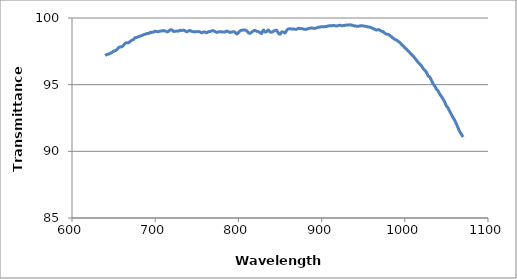
| Category | Series 0 |
|---|---|
| 640.0 | 97.18 |
| 642.0 | 97.267 |
| 644.0 | 97.294 |
| 646.0 | 97.35 |
| 648.0 | 97.417 |
| 650.0 | 97.508 |
| 652.0 | 97.548 |
| 654.0 | 97.626 |
| 656.0 | 97.777 |
| 658.0 | 97.829 |
| 660.0 | 97.851 |
| 662.0 | 97.962 |
| 664.0 | 98.097 |
| 666.0 | 98.143 |
| 668.0 | 98.143 |
| 670.0 | 98.254 |
| 672.0 | 98.333 |
| 674.0 | 98.396 |
| 676.0 | 98.529 |
| 678.0 | 98.548 |
| 680.0 | 98.592 |
| 682.0 | 98.65 |
| 684.0 | 98.682 |
| 686.0 | 98.746 |
| 688.0 | 98.785 |
| 690.0 | 98.833 |
| 692.0 | 98.835 |
| 694.0 | 98.919 |
| 696.0 | 98.922 |
| 698.0 | 98.95 |
| 700.0 | 99.012 |
| 702.0 | 98.981 |
| 704.0 | 98.979 |
| 706.0 | 99.022 |
| 708.0 | 99.031 |
| 710.0 | 99.052 |
| 712.0 | 99.031 |
| 714.0 | 98.967 |
| 716.0 | 98.996 |
| 718.0 | 99.116 |
| 720.0 | 99.101 |
| 722.0 | 98.987 |
| 724.0 | 99.009 |
| 726.0 | 99.019 |
| 728.0 | 99.016 |
| 730.0 | 99.079 |
| 732.0 | 99.059 |
| 734.0 | 99.092 |
| 736.0 | 99.035 |
| 738.0 | 98.96 |
| 740.0 | 99.029 |
| 742.0 | 99.061 |
| 744.0 | 98.989 |
| 746.0 | 98.975 |
| 748.0 | 98.969 |
| 750.0 | 98.973 |
| 752.0 | 98.988 |
| 754.0 | 98.947 |
| 756.0 | 98.892 |
| 758.0 | 98.947 |
| 760.0 | 98.951 |
| 762.0 | 98.889 |
| 764.0 | 98.976 |
| 766.0 | 98.988 |
| 768.0 | 99.035 |
| 770.0 | 99.045 |
| 772.0 | 98.977 |
| 774.0 | 98.927 |
| 776.0 | 98.953 |
| 778.0 | 98.978 |
| 780.0 | 98.951 |
| 782.0 | 98.943 |
| 784.0 | 98.951 |
| 786.0 | 99.023 |
| 788.0 | 98.966 |
| 790.0 | 98.918 |
| 792.0 | 98.949 |
| 794.0 | 98.977 |
| 796.0 | 98.93 |
| 798.0 | 98.804 |
| 800.0 | 98.897 |
| 802.0 | 99.034 |
| 804.0 | 99.078 |
| 806.0 | 99.098 |
| 808.0 | 99.096 |
| 810.0 | 99.035 |
| 812.0 | 98.895 |
| 814.0 | 98.853 |
| 816.0 | 98.942 |
| 818.0 | 99.027 |
| 820.0 | 99.066 |
| 822.0 | 99.003 |
| 824.0 | 98.985 |
| 826.0 | 98.9 |
| 828.0 | 98.849 |
| 830.0 | 99.096 |
| 832.0 | 98.959 |
| 834.0 | 98.978 |
| 836.0 | 99.1 |
| 838.0 | 98.965 |
| 840.0 | 98.935 |
| 842.0 | 99 |
| 844.0 | 99.062 |
| 846.0 | 99.078 |
| 848.0 | 98.867 |
| 850.0 | 98.786 |
| 852.0 | 98.951 |
| 854.0 | 98.936 |
| 856.0 | 98.881 |
| 858.0 | 99.069 |
| 860.0 | 99.177 |
| 862.0 | 99.194 |
| 864.0 | 99.174 |
| 866.0 | 99.17 |
| 868.0 | 99.155 |
| 870.0 | 99.156 |
| 872.0 | 99.224 |
| 874.0 | 99.205 |
| 876.0 | 99.205 |
| 878.0 | 99.173 |
| 880.0 | 99.148 |
| 882.0 | 99.157 |
| 884.0 | 99.213 |
| 886.0 | 99.235 |
| 888.0 | 99.251 |
| 890.0 | 99.232 |
| 892.0 | 99.222 |
| 894.0 | 99.261 |
| 896.0 | 99.306 |
| 898.0 | 99.317 |
| 900.0 | 99.344 |
| 902.0 | 99.341 |
| 904.0 | 99.353 |
| 906.0 | 99.368 |
| 908.0 | 99.404 |
| 910.0 | 99.422 |
| 912.0 | 99.42 |
| 914.0 | 99.441 |
| 916.0 | 99.424 |
| 918.0 | 99.396 |
| 920.0 | 99.436 |
| 922.0 | 99.461 |
| 924.0 | 99.425 |
| 926.0 | 99.428 |
| 928.0 | 99.453 |
| 930.0 | 99.472 |
| 932.0 | 99.466 |
| 934.0 | 99.489 |
| 936.0 | 99.47 |
| 938.0 | 99.434 |
| 940.0 | 99.396 |
| 942.0 | 99.389 |
| 944.0 | 99.381 |
| 946.0 | 99.399 |
| 948.0 | 99.423 |
| 950.0 | 99.402 |
| 952.0 | 99.379 |
| 954.0 | 99.36 |
| 956.0 | 99.325 |
| 958.0 | 99.312 |
| 960.0 | 99.261 |
| 962.0 | 99.213 |
| 964.0 | 99.15 |
| 966.0 | 99.095 |
| 968.0 | 99.132 |
| 970.0 | 99.082 |
| 972.0 | 99.005 |
| 974.0 | 98.976 |
| 976.0 | 98.859 |
| 978.0 | 98.791 |
| 980.0 | 98.777 |
| 982.0 | 98.688 |
| 984.0 | 98.595 |
| 986.0 | 98.489 |
| 988.0 | 98.404 |
| 990.0 | 98.339 |
| 992.0 | 98.255 |
| 994.0 | 98.16 |
| 996.0 | 98.021 |
| 998.0 | 97.913 |
| 1000.0 | 97.768 |
| 1002.0 | 97.666 |
| 1004.0 | 97.532 |
| 1006.0 | 97.408 |
| 1008.0 | 97.261 |
| 1010.0 | 97.147 |
| 1012.0 | 96.996 |
| 1014.0 | 96.84 |
| 1016.0 | 96.684 |
| 1018.0 | 96.553 |
| 1020.0 | 96.409 |
| 1022.0 | 96.215 |
| 1024.0 | 96.081 |
| 1026.0 | 95.925 |
| 1028.0 | 95.668 |
| 1030.0 | 95.567 |
| 1032.0 | 95.328 |
| 1034.0 | 95.066 |
| 1036.0 | 94.894 |
| 1038.0 | 94.672 |
| 1040.0 | 94.529 |
| 1042.0 | 94.294 |
| 1044.0 | 94.116 |
| 1046.0 | 93.921 |
| 1048.0 | 93.695 |
| 1050.0 | 93.408 |
| 1052.0 | 93.249 |
| 1054.0 | 92.995 |
| 1056.0 | 92.773 |
| 1058.0 | 92.53 |
| 1060.0 | 92.323 |
| 1062.0 | 92.053 |
| 1064.0 | 91.761 |
| 1066.0 | 91.48 |
| 1068.0 | 91.284 |
| 1070.0 | 91.071 |